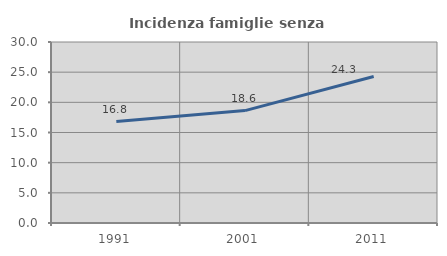
| Category | Incidenza famiglie senza nuclei |
|---|---|
| 1991.0 | 16.812 |
| 2001.0 | 18.629 |
| 2011.0 | 24.272 |